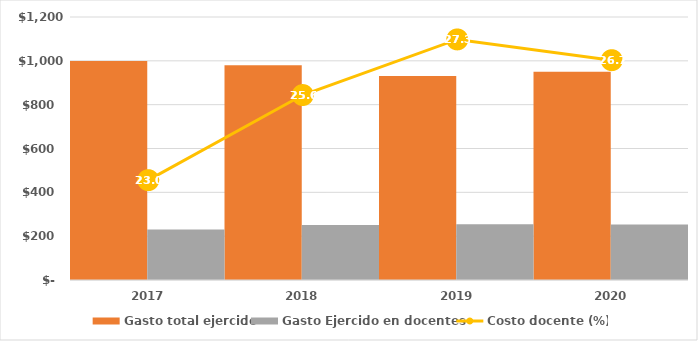
| Category | Gasto total ejercido | Gasto Ejercido en docentes |
|---|---|---|
| 2017 | 998802.519 | 230094.013 |
| 2018 | 979910 | 251110 |
| 2019 | 930744.078 | 254254.971 |
| 2020 | 949931.095 | 253504.286 |